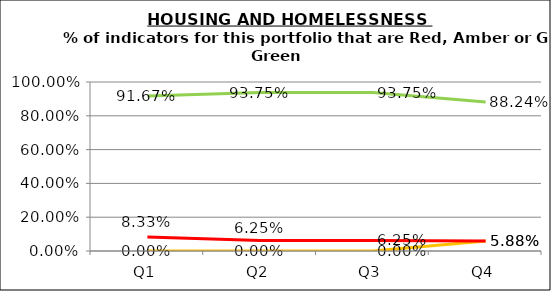
| Category | Green | Amber | Red |
|---|---|---|---|
| Q1 | 0.917 | 0 | 0.083 |
| Q2 | 0.938 | 0 | 0.062 |
| Q3 | 0.938 | 0 | 0.062 |
| Q4 | 0.882 | 0.059 | 0.059 |